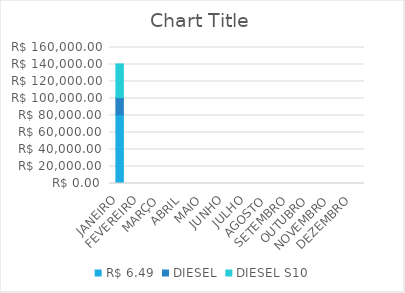
| Category | R$ 6,49 | DIESEL | DIESEL S10 |
|---|---|---|---|
| JANEIRO | 80787.465 | 20339.208 | 39581.675 |
| FEVEREIRO | 0 | 0 | 0 |
| MARÇO | 0 | 0 | 0 |
| ABRIL | 0 | 0 | 0 |
| MAIO | 0 | 0 | 0 |
| JUNHO | 0 | 0 | 0 |
| JULHO | 0 | 0 | 0 |
| AGOSTO | 0 | 0 | 0 |
| SETEMBRO | 0 | 0 | 0 |
| OUTUBRO | 0 | 0 | 0 |
| NOVEMBRO | 0 | 0 | 0 |
| DEZEMBRO | 0 | 0 | 0 |